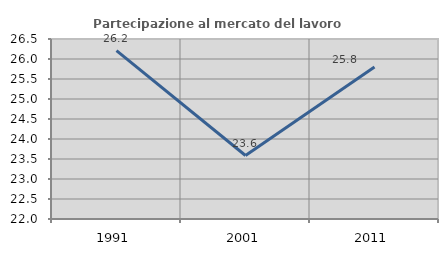
| Category | Partecipazione al mercato del lavoro  femminile |
|---|---|
| 1991.0 | 26.21 |
| 2001.0 | 23.587 |
| 2011.0 | 25.8 |